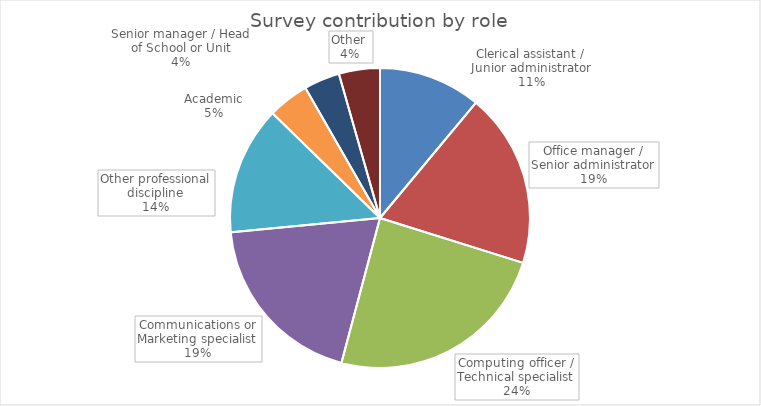
| Category | Series 0 |
|---|---|
| Clerical assistant / Junior administrator | 0.11 |
| Office manager / Senior administrator | 0.188 |
| Computing officer / Technical specialist | 0.243 |
| Communications or Marketing specialist | 0.193 |
| Other professional discipline | 0.138 |
| Academic | 0.044 |
| Senior manager / Head of School or Unit | 0.039 |
| Other  | 0.044 |